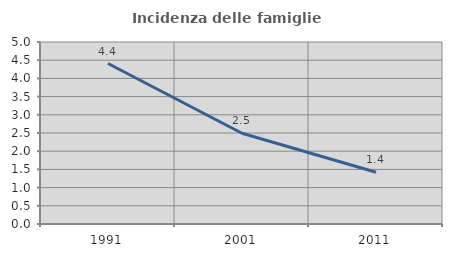
| Category | Incidenza delle famiglie numerose |
|---|---|
| 1991.0 | 4.409 |
| 2001.0 | 2.493 |
| 2011.0 | 1.421 |